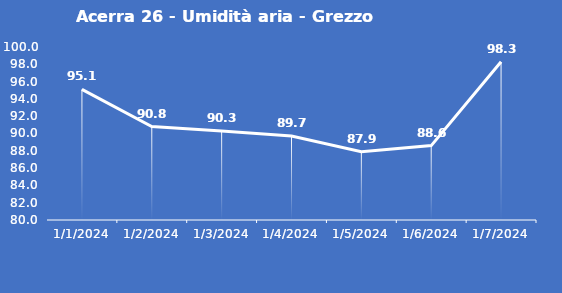
| Category | Acerra 26 - Umidità aria - Grezzo (%) |
|---|---|
| 1/1/24 | 95.1 |
| 1/2/24 | 90.8 |
| 1/3/24 | 90.3 |
| 1/4/24 | 89.7 |
| 1/5/24 | 87.9 |
| 1/6/24 | 88.6 |
| 1/7/24 | 98.3 |